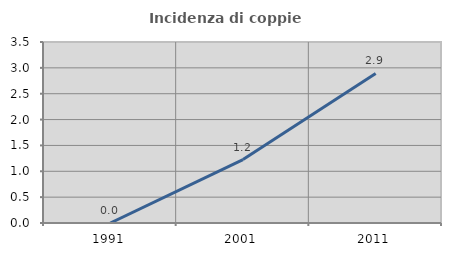
| Category | Incidenza di coppie miste |
|---|---|
| 1991.0 | 0 |
| 2001.0 | 1.226 |
| 2011.0 | 2.892 |